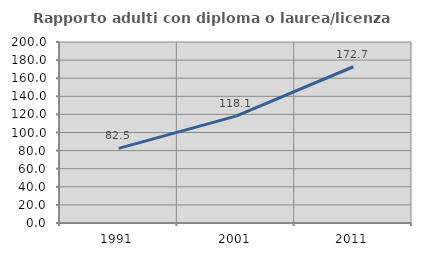
| Category | Rapporto adulti con diploma o laurea/licenza media  |
|---|---|
| 1991.0 | 82.5 |
| 2001.0 | 118.061 |
| 2011.0 | 172.66 |